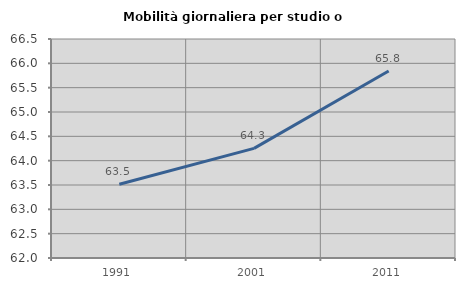
| Category | Mobilità giornaliera per studio o lavoro |
|---|---|
| 1991.0 | 63.515 |
| 2001.0 | 64.253 |
| 2011.0 | 65.844 |